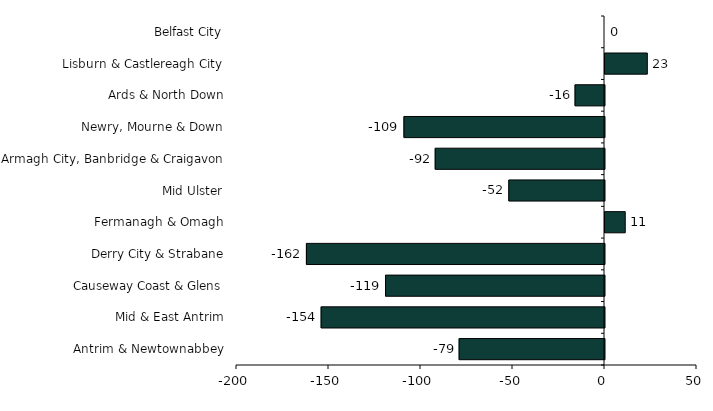
| Category | Series 0 |
|---|---|
| Belfast City | 0 |
| Lisburn & Castlereagh City | 23 |
| Ards & North Down | -16 |
| Newry, Mourne & Down | -109 |
| Armagh City, Banbridge & Craigavon | -92 |
| Mid Ulster | -52 |
| Fermanagh & Omagh | 11 |
| Derry City & Strabane | -162 |
| Causeway Coast & Glens | -119 |
| Mid & East Antrim | -154 |
| Antrim & Newtownabbey | -79 |